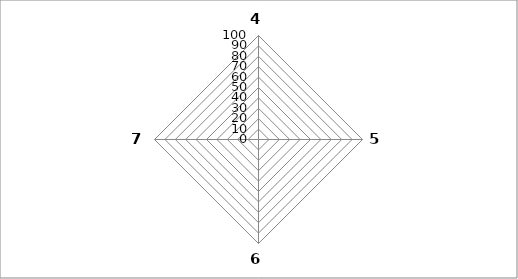
| Category | Series 0 |
|---|---|
| 4.0 | 0 |
| 5.0 | 0 |
| 6.0 | 0 |
| 7.0 | 0 |